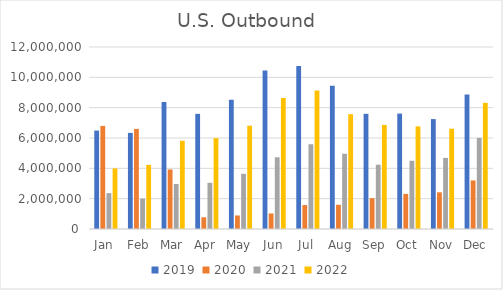
| Category | 2019 | 2020 | 2021 | 2022 |
|---|---|---|---|---|
| Jan | 6489936.806 | 6797079 | 2363136.892 | 3995678.416 |
| Feb | 6335412.593 | 6601177.9 | 2001113.688 | 4228608.838 |
| Mar | 8374670.415 | 3926650 | 2968521.7 | 5816932.271 |
| Apr | 7592306.487 | 771432 | 3044340.003 | 5989987.958 |
| May | 8529518.996 | 891525.1 | 3639839.17 | 6811865.539 |
| Jun | 10444011.047 | 1023999.7 | 4729068.767 | 8633239.314 |
| Jul | 10745666.698 | 1578370.1 | 5588570.274 | 9126334.164 |
| Aug | 9438441.923 | 1597311.3 | 4959863.705 | 7570847.464 |
| Sep | 7593151.729 | 2034545.6 | 4242385.323 | 6859703.448 |
| Oct | 7608284.785 | 2313216.3 | 4502048.202 | 6763557.475 |
| Nov | 7247525.379 | 2421041.9 | 4689578.329 | 6614811.376 |
| Dec | 8871568.78 | 3203915.6 | 6006789.737 | 8318147.222 |